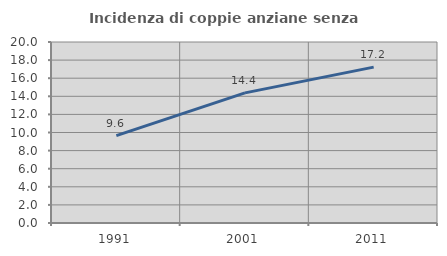
| Category | Incidenza di coppie anziane senza figli  |
|---|---|
| 1991.0 | 9.648 |
| 2001.0 | 14.381 |
| 2011.0 | 17.226 |